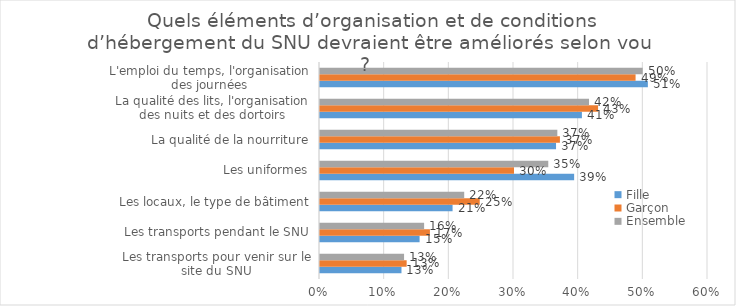
| Category | Fille | Garçon | Ensemble |
|---|---|---|---|
| Les transports pour venir sur le site du SNU | 0.126 | 0.134 | 0.13 |
| Les transports pendant le SNU | 0.154 | 0.17 | 0.161 |
| Les locaux, le type de bâtiment | 0.205 | 0.247 | 0.223 |
| Les uniformes | 0.393 | 0.3 | 0.353 |
| La qualité de la nourriture | 0.365 | 0.371 | 0.367 |
| La qualité des lits, l'organisation des nuits et des dortoirs | 0.405 | 0.43 | 0.416 |
| L'emploi du temps, l'organisation des journées | 0.507 | 0.488 | 0.499 |